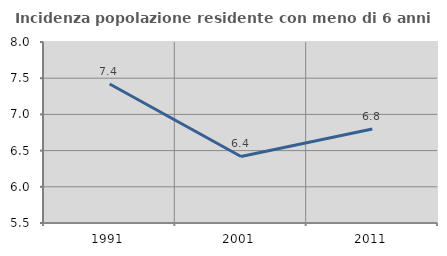
| Category | Incidenza popolazione residente con meno di 6 anni |
|---|---|
| 1991.0 | 7.419 |
| 2001.0 | 6.419 |
| 2011.0 | 6.798 |